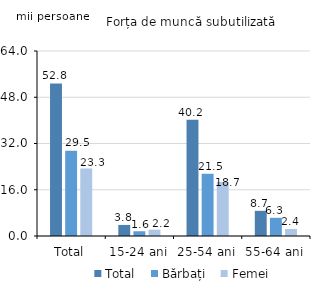
| Category | Total | Bărbați | Femei |
|---|---|---|---|
| Total | 52.772 | 29.462 | 23.31 |
| 15-24 ani | 3.826 | 1.643 | 2.183 |
| 25-54 ani | 40.239 | 21.527 | 18.712 |
| 55-64 ani | 8.707 | 6.292 | 2.415 |